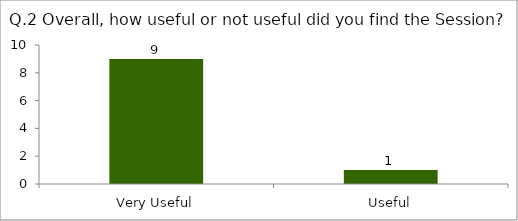
| Category | Q.2 Overall, how useful or not useful did you find the Session? |
|---|---|
| Very Useful | 9 |
| Useful | 1 |